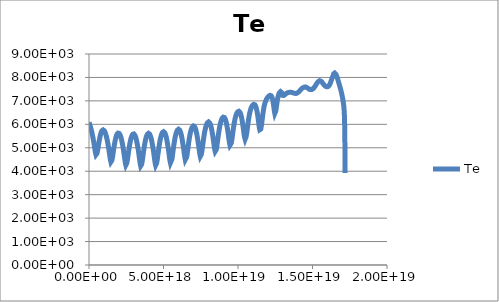
| Category | Te |
|---|---|
| 47421200000000.0 | 6086 |
| 284527000000000.0 | 6085.2 |
| 1232950000000000.0 | 6083.3 |
| 5026650000000000.0 | 6077.5 |
| 1.2007e+16 | 6064.4 |
| 2.10816e+16 | 6047.1 |
| 3.28784e+16 | 6026 |
| 4.82144e+16 | 5998.6 |
| 6.81511e+16 | 5959.8 |
| 9.19197e+16 | 5909.5 |
| 1.1692e+17 | 5852.3 |
| 1.4192e+17 | 5791.1 |
| 1.6692e+17 | 5726 |
| 1.9192e+17 | 5653.7 |
| 2.16501e+17 | 5580.8 |
| 2.39133e+17 | 5512.5 |
| 2.59097e+17 | 5448.9 |
| 2.77106e+17 | 5388 |
| 2.93684e+17 | 5330.7 |
| 3.09152e+17 | 5275.1 |
| 3.23729e+17 | 5221 |
| 3.37601e+17 | 5168.2 |
| 3.50903e+17 | 5116.3 |
| 3.63764e+17 | 5065.7 |
| 3.75989e+17 | 5018 |
| 3.87677e+17 | 4971.3 |
| 3.99209e+17 | 4925.4 |
| 4.12395e+17 | 4867.5 |
| 4.25562e+17 | 4826.5 |
| 4.38707e+17 | 4775.9 |
| 4.52783e+17 | 4738 |
| 4.6807e+17 | 4702.7 |
| 4.87942e+17 | 4683.5 |
| 5.11675e+17 | 4703.2 |
| 5.36675e+17 | 4760.1 |
| 5.61675e+17 | 4842.6 |
| 5.80268e+17 | 4884.3 |
| 5.92436e+17 | 4935.2 |
| 6.04271e+17 | 4979.9 |
| 6.17516e+17 | 5039.6 |
| 6.30871e+17 | 5082.1 |
| 6.4437e+17 | 5145 |
| 6.58497e+17 | 5191.2 |
| 6.73441e+17 | 5255.7 |
| 6.89322e+17 | 5305.9 |
| 7.0402e+17 | 5352.4 |
| 7.20723e+17 | 5415.2 |
| 7.38614e+17 | 5460.9 |
| 7.58051e+17 | 5524.2 |
| 7.79392e+17 | 5573.2 |
| 7.99955e+17 | 5620.9 |
| 8.22662e+17 | 5669.4 |
| 8.47662e+17 | 5708.7 |
| 8.72662e+17 | 5727.7 |
| 8.97662e+17 | 5747.6 |
| 9.22662e+17 | 5761.6 |
| 9.47662e+17 | 5763 |
| 9.72662e+17 | 5760.4 |
| 9.97662e+17 | 5747.8 |
| 1.02266e+18 | 5729.4 |
| 1.04766e+18 | 5704.1 |
| 1.07266e+18 | 5672.5 |
| 1.09766e+18 | 5631.7 |
| 1.12266e+18 | 5584 |
| 1.14766e+18 | 5529.5 |
| 1.17266e+18 | 5468.5 |
| 1.19766e+18 | 5396.7 |
| 1.22156e+18 | 5326.9 |
| 1.24313e+18 | 5259.7 |
| 1.26244e+18 | 5195.4 |
| 1.28e+18 | 5133.3 |
| 1.29624e+18 | 5072.8 |
| 1.31142e+18 | 5013.9 |
| 1.32577e+18 | 4956.1 |
| 1.33945e+18 | 4898.4 |
| 1.35259e+18 | 4842.8 |
| 1.3653e+18 | 4787.9 |
| 1.37769e+18 | 4733.9 |
| 1.38951e+18 | 4684.1 |
| 1.40087e+18 | 4634.7 |
| 1.41391e+18 | 4573.1 |
| 1.42696e+18 | 4527.7 |
| 1.44002e+18 | 4474.7 |
| 1.45405e+18 | 4437 |
| 1.46936e+18 | 4398.8 |
| 1.48925e+18 | 4377.8 |
| 1.513e+18 | 4401.9 |
| 1.538e+18 | 4466.9 |
| 1.563e+18 | 4558.8 |
| 1.58167e+18 | 4609.4 |
| 1.59368e+18 | 4662.7 |
| 1.6071e+18 | 4726.7 |
| 1.62046e+18 | 4779 |
| 1.63372e+18 | 4848.8 |
| 1.64752e+18 | 4895.4 |
| 1.662e+18 | 4972.8 |
| 1.67732e+18 | 5021.9 |
| 1.69141e+18 | 5078.7 |
| 1.70739e+18 | 5143.4 |
| 1.72443e+18 | 5202.6 |
| 1.74286e+18 | 5268 |
| 1.76294e+18 | 5325.8 |
| 1.78209e+18 | 5373.6 |
| 1.80389e+18 | 5439 |
| 1.82788e+18 | 5484.6 |
| 1.85205e+18 | 5530.1 |
| 1.87705e+18 | 5575.2 |
| 1.90205e+18 | 5590.8 |
| 1.92705e+18 | 5617.5 |
| 1.95205e+18 | 5624.9 |
| 1.97705e+18 | 5629.7 |
| 2.00205e+18 | 5622.9 |
| 2.02705e+18 | 5610.6 |
| 2.05205e+18 | 5589.5 |
| 2.07705e+18 | 5560.5 |
| 2.10205e+18 | 5523.5 |
| 2.12705e+18 | 5478 |
| 2.15205e+18 | 5424.2 |
| 2.17705e+18 | 5363.4 |
| 2.20205e+18 | 5290.1 |
| 2.22705e+18 | 5211.6 |
| 2.24922e+18 | 5144.6 |
| 2.26774e+18 | 5079.6 |
| 2.28474e+18 | 5016.5 |
| 2.30052e+18 | 4954.7 |
| 2.31533e+18 | 4894.2 |
| 2.32936e+18 | 4834.8 |
| 2.34275e+18 | 4776.4 |
| 2.35564e+18 | 4718.9 |
| 2.36812e+18 | 4662.3 |
| 2.3803e+18 | 4606.7 |
| 2.39229e+18 | 4551.8 |
| 2.40386e+18 | 4500.3 |
| 2.41675e+18 | 4438 |
| 2.42971e+18 | 4391.1 |
| 2.44278e+18 | 4337.7 |
| 2.45694e+18 | 4299.6 |
| 2.47252e+18 | 4263.3 |
| 2.49278e+18 | 4246.9 |
| 2.51672e+18 | 4279.4 |
| 2.54172e+18 | 4352.4 |
| 2.56672e+18 | 4451.4 |
| 2.58536e+18 | 4504.9 |
| 2.59735e+18 | 4558.1 |
| 2.61081e+18 | 4628.6 |
| 2.62431e+18 | 4682.8 |
| 2.63785e+18 | 4753 |
| 2.65198e+18 | 4811 |
| 2.66688e+18 | 4884.9 |
| 2.68195e+18 | 4940.9 |
| 2.69724e+18 | 5011.1 |
| 2.71364e+18 | 5071 |
| 2.73148e+18 | 5144.6 |
| 2.74993e+18 | 5194.6 |
| 2.76918e+18 | 5269.8 |
| 2.78953e+18 | 5315.8 |
| 2.81131e+18 | 5386.6 |
| 2.83584e+18 | 5432.5 |
| 2.86055e+18 | 5478 |
| 2.88555e+18 | 5523.7 |
| 2.91055e+18 | 5555.1 |
| 2.93555e+18 | 5574.9 |
| 2.96055e+18 | 5589.1 |
| 2.98555e+18 | 5593.3 |
| 3.01055e+18 | 5589.3 |
| 3.03555e+18 | 5577.9 |
| 3.06055e+18 | 5555.2 |
| 3.08555e+18 | 5527.4 |
| 3.11055e+18 | 5490.2 |
| 3.13555e+18 | 5443.8 |
| 3.16055e+18 | 5389.1 |
| 3.18555e+18 | 5326.3 |
| 3.21055e+18 | 5249.6 |
| 3.23555e+18 | 5167.7 |
| 3.26055e+18 | 5077.1 |
| 3.28104e+18 | 5014.1 |
| 3.29671e+18 | 4951.4 |
| 3.31157e+18 | 4889.9 |
| 3.32562e+18 | 4829.6 |
| 3.339e+18 | 4770.2 |
| 3.35185e+18 | 4711.8 |
| 3.36427e+18 | 4654.3 |
| 3.37636e+18 | 4597.7 |
| 3.38823e+18 | 4542.1 |
| 3.39999e+18 | 4487.4 |
| 3.41348e+18 | 4418.9 |
| 3.42664e+18 | 4371.2 |
| 3.43937e+18 | 4316.4 |
| 3.45303e+18 | 4279.4 |
| 3.46793e+18 | 4229.5 |
| 3.48728e+18 | 4215 |
| 3.51072e+18 | 4232.1 |
| 3.53572e+18 | 4298.2 |
| 3.56072e+18 | 4394.6 |
| 3.57924e+18 | 4447 |
| 3.59123e+18 | 4505.9 |
| 3.60316e+18 | 4558 |
| 3.61685e+18 | 4631.8 |
| 3.63065e+18 | 4689 |
| 3.64459e+18 | 4762.8 |
| 3.65922e+18 | 4824.7 |
| 3.67261e+18 | 4883.9 |
| 3.68786e+18 | 4958.2 |
| 3.70396e+18 | 5019.8 |
| 3.72114e+18 | 5095.9 |
| 3.73885e+18 | 5153.1 |
| 3.75723e+18 | 5226 |
| 3.77676e+18 | 5277.8 |
| 3.79776e+18 | 5351.6 |
| 3.82095e+18 | 5402.9 |
| 3.84476e+18 | 5463.4 |
| 3.86976e+18 | 5509.5 |
| 3.89476e+18 | 5547.6 |
| 3.91976e+18 | 5579.5 |
| 3.94476e+18 | 5598.2 |
| 3.96976e+18 | 5612.3 |
| 3.99476e+18 | 5616.7 |
| 4.01976e+18 | 5612.6 |
| 4.04476e+18 | 5599.6 |
| 4.06976e+18 | 5579.9 |
| 4.09476e+18 | 5549.5 |
| 4.11976e+18 | 5510.8 |
| 4.14476e+18 | 5463 |
| 4.16976e+18 | 5406.7 |
| 4.19476e+18 | 5337.3 |
| 4.21976e+18 | 5261.4 |
| 4.24476e+18 | 5176.1 |
| 4.26976e+18 | 5081.8 |
| 4.28979e+18 | 5020.5 |
| 4.30462e+18 | 4958.6 |
| 4.31884e+18 | 4897.9 |
| 4.33232e+18 | 4838.2 |
| 4.34522e+18 | 4779.5 |
| 4.35765e+18 | 4721.7 |
| 4.36971e+18 | 4664.9 |
| 4.38149e+18 | 4609 |
| 4.39309e+18 | 4554.1 |
| 4.40463e+18 | 4500.2 |
| 4.4179e+18 | 4433.2 |
| 4.43095e+18 | 4386.4 |
| 4.44372e+18 | 4333.1 |
| 4.45761e+18 | 4294.8 |
| 4.47297e+18 | 4258.4 |
| 4.49294e+18 | 4241.1 |
| 4.51673e+18 | 4276.1 |
| 4.54173e+18 | 4351.6 |
| 4.56673e+18 | 4454.1 |
| 4.58505e+18 | 4506.9 |
| 4.59844e+18 | 4578.6 |
| 4.61191e+18 | 4635.2 |
| 4.6255e+18 | 4709.3 |
| 4.63953e+18 | 4770.1 |
| 4.65207e+18 | 4828.5 |
| 4.66631e+18 | 4902.6 |
| 4.68117e+18 | 4963.5 |
| 4.69686e+18 | 5039.6 |
| 4.71364e+18 | 5104.4 |
| 4.72917e+18 | 5163.3 |
| 4.74668e+18 | 5235.8 |
| 4.76529e+18 | 5296.2 |
| 4.78535e+18 | 5365.5 |
| 4.80757e+18 | 5425.4 |
| 4.83095e+18 | 5485.8 |
| 4.85595e+18 | 5537.4 |
| 4.88095e+18 | 5584.5 |
| 4.90595e+18 | 5622.5 |
| 4.93095e+18 | 5653 |
| 4.95595e+18 | 5668 |
| 4.98095e+18 | 5681.7 |
| 5.00595e+18 | 5684.9 |
| 5.03095e+18 | 5680.3 |
| 5.05595e+18 | 5666 |
| 5.08095e+18 | 5643.1 |
| 5.10595e+18 | 5611.6 |
| 5.13095e+18 | 5570.9 |
| 5.15595e+18 | 5520.7 |
| 5.18095e+18 | 5462 |
| 5.20595e+18 | 5388.9 |
| 5.23095e+18 | 5309.5 |
| 5.25595e+18 | 5220.4 |
| 5.28095e+18 | 5122.2 |
| 5.30527e+18 | 5021.7 |
| 5.32343e+18 | 4963.3 |
| 5.33802e+18 | 4888.8 |
| 5.3522e+18 | 4832.5 |
| 5.36405e+18 | 4776.3 |
| 5.37573e+18 | 4720.8 |
| 5.38719e+18 | 4666.1 |
| 5.39851e+18 | 4611.8 |
| 5.41148e+18 | 4545.7 |
| 5.42448e+18 | 4495.8 |
| 5.4375e+18 | 4438.3 |
| 5.45102e+18 | 4399.1 |
| 5.4652e+18 | 4358.6 |
| 5.48363e+18 | 4328.2 |
| 5.50655e+18 | 4340.3 |
| 5.53155e+18 | 4400.5 |
| 5.55655e+18 | 4494 |
| 5.57546e+18 | 4549.7 |
| 5.58804e+18 | 4606.6 |
| 5.60031e+18 | 4664.6 |
| 5.61434e+18 | 4741.3 |
| 5.62847e+18 | 4801.5 |
| 5.64068e+18 | 4859.4 |
| 5.65449e+18 | 4933.3 |
| 5.66884e+18 | 4993.8 |
| 5.68387e+18 | 5069.9 |
| 5.69914e+18 | 5128.5 |
| 5.71471e+18 | 5200.8 |
| 5.73116e+18 | 5259.5 |
| 5.74875e+18 | 5333.4 |
| 5.7676e+18 | 5392.8 |
| 5.78809e+18 | 5466 |
| 5.81075e+18 | 5527.4 |
| 5.83433e+18 | 5589.9 |
| 5.85933e+18 | 5637.1 |
| 5.88433e+18 | 5685.5 |
| 5.90933e+18 | 5724.9 |
| 5.93433e+18 | 5754 |
| 5.95933e+18 | 5774.4 |
| 5.98433e+18 | 5786.5 |
| 6.00933e+18 | 5790.6 |
| 6.03433e+18 | 5787.3 |
| 6.05933e+18 | 5774.1 |
| 6.08433e+18 | 5752.1 |
| 6.10933e+18 | 5721.5 |
| 6.13433e+18 | 5681.7 |
| 6.15933e+18 | 5632.4 |
| 6.18433e+18 | 5574.1 |
| 6.20933e+18 | 5500.9 |
| 6.23433e+18 | 5421.2 |
| 6.25933e+18 | 5331.6 |
| 6.28421e+18 | 5233.7 |
| 6.30782e+18 | 5137.6 |
| 6.3295e+18 | 5043.2 |
| 6.34572e+18 | 4995 |
| 6.35898e+18 | 4917.9 |
| 6.37182e+18 | 4872.6 |
| 6.3841e+18 | 4800.1 |
| 6.39624e+18 | 4750.8 |
| 6.40818e+18 | 4689.1 |
| 6.42045e+18 | 4640 |
| 6.43314e+18 | 4582.1 |
| 6.4465e+18 | 4537.9 |
| 6.46073e+18 | 4491.6 |
| 6.47922e+18 | 4457.6 |
| 6.50217e+18 | 4462.1 |
| 6.52717e+18 | 4514.5 |
| 6.55217e+18 | 4602.6 |
| 6.57152e+18 | 4660.4 |
| 6.58471e+18 | 4717.8 |
| 6.59725e+18 | 4776.3 |
| 6.61155e+18 | 4854.1 |
| 6.62523e+18 | 4908.8 |
| 6.63814e+18 | 4979 |
| 6.65163e+18 | 5038.1 |
| 6.66589e+18 | 5113.2 |
| 6.68024e+18 | 5170.6 |
| 6.6947e+18 | 5241.8 |
| 6.70989e+18 | 5303.2 |
| 6.72604e+18 | 5373.6 |
| 6.74331e+18 | 5437.8 |
| 6.76204e+18 | 5508.8 |
| 6.78237e+18 | 5570.7 |
| 6.80462e+18 | 5643.6 |
| 6.82875e+18 | 5698.1 |
| 6.85287e+18 | 5759.3 |
| 6.87787e+18 | 5811.8 |
| 6.90287e+18 | 5847.6 |
| 6.92787e+18 | 5881.9 |
| 6.95287e+18 | 5902.3 |
| 6.97787e+18 | 5920.4 |
| 7.00287e+18 | 5928.8 |
| 7.02787e+18 | 5929.3 |
| 7.05287e+18 | 5921 |
| 7.07787e+18 | 5903.9 |
| 7.10287e+18 | 5878.2 |
| 7.12787e+18 | 5843.1 |
| 7.15287e+18 | 5798.4 |
| 7.17787e+18 | 5744.8 |
| 7.20287e+18 | 5676.5 |
| 7.22787e+18 | 5601.1 |
| 7.25287e+18 | 5515.3 |
| 7.2775e+18 | 5422.6 |
| 7.30063e+18 | 5331.1 |
| 7.32187e+18 | 5240.5 |
| 7.34178e+18 | 5151.3 |
| 7.35691e+18 | 5105.5 |
| 7.36948e+18 | 5031.6 |
| 7.38172e+18 | 4988.9 |
| 7.39354e+18 | 4919.8 |
| 7.40529e+18 | 4876.4 |
| 7.41697e+18 | 4814.8 |
| 7.42898e+18 | 4770.4 |
| 7.44144e+18 | 4716.9 |
| 7.45498e+18 | 4677.2 |
| 7.46991e+18 | 4635.4 |
| 7.48932e+18 | 4619.2 |
| 7.51279e+18 | 4646 |
| 7.53779e+18 | 4714.3 |
| 7.56279e+18 | 4811.4 |
| 7.58162e+18 | 4867.4 |
| 7.59618e+18 | 4944 |
| 7.61064e+18 | 5003.8 |
| 7.6227e+18 | 5060.3 |
| 7.6361e+18 | 5133.1 |
| 7.64988e+18 | 5192.7 |
| 7.66215e+18 | 5253.2 |
| 7.67608e+18 | 5321.3 |
| 7.69046e+18 | 5382.7 |
| 7.70541e+18 | 5450.9 |
| 7.72134e+18 | 5512.6 |
| 7.73853e+18 | 5585.8 |
| 7.75708e+18 | 5649.3 |
| 7.77739e+18 | 5723.9 |
| 7.79897e+18 | 5778.3 |
| 7.82158e+18 | 5850.7 |
| 7.84658e+18 | 5902.7 |
| 7.87158e+18 | 5953.3 |
| 7.89658e+18 | 6006.5 |
| 7.92158e+18 | 6039.2 |
| 7.94658e+18 | 6064.3 |
| 7.97158e+18 | 6085.6 |
| 7.99658e+18 | 6097.7 |
| 8.02158e+18 | 6102.2 |
| 8.04658e+18 | 6098.6 |
| 8.07158e+18 | 6087.6 |
| 8.09658e+18 | 6059.1 |
| 8.12158e+18 | 6035.1 |
| 8.14658e+18 | 5997.5 |
| 8.17158e+18 | 5948.6 |
| 8.19658e+18 | 5885.8 |
| 8.22158e+18 | 5815.1 |
| 8.24658e+18 | 5733.7 |
| 8.27085e+18 | 5647.3 |
| 8.29331e+18 | 5561.4 |
| 8.31394e+18 | 5475.8 |
| 8.33327e+18 | 5390.9 |
| 8.35163e+18 | 5307.1 |
| 8.36928e+18 | 5225 |
| 8.383e+18 | 5179.6 |
| 8.39458e+18 | 5115.2 |
| 8.40616e+18 | 5070.7 |
| 8.41775e+18 | 5012.4 |
| 8.42961e+18 | 4970.5 |
| 8.44182e+18 | 4914.6 |
| 8.45498e+18 | 4880.8 |
| 8.46937e+18 | 4844.6 |
| 8.48807e+18 | 4824.1 |
| 8.51115e+18 | 4846.9 |
| 8.53615e+18 | 4911.3 |
| 8.56115e+18 | 5005.7 |
| 8.58026e+18 | 5063.4 |
| 8.59268e+18 | 5118.4 |
| 8.60602e+18 | 5187.6 |
| 8.61931e+18 | 5246.1 |
| 8.63253e+18 | 5315 |
| 8.64561e+18 | 5370 |
| 8.6585e+18 | 5437.7 |
| 8.67195e+18 | 5497 |
| 8.6861e+18 | 5566.3 |
| 8.70105e+18 | 5629.9 |
| 8.71702e+18 | 5700.3 |
| 8.73369e+18 | 5752.2 |
| 8.75128e+18 | 5831.8 |
| 8.76991e+18 | 5883 |
| 8.78991e+18 | 5960 |
| 8.81186e+18 | 6012.3 |
| 8.83501e+18 | 6082.7 |
| 8.86001e+18 | 6134.4 |
| 8.88501e+18 | 6181.1 |
| 8.91001e+18 | 6221.8 |
| 8.93501e+18 | 6253.9 |
| 8.96001e+18 | 6278.6 |
| 8.98501e+18 | 6296.2 |
| 9.01001e+18 | 6306.6 |
| 9.03501e+18 | 6310.6 |
| 9.06001e+18 | 6305.5 |
| 9.08501e+18 | 6292 |
| 9.11001e+18 | 6270.3 |
| 9.13501e+18 | 6239.3 |
| 9.16001e+18 | 6198.8 |
| 9.18501e+18 | 6148.5 |
| 9.21001e+18 | 6082.9 |
| 9.23501e+18 | 6009.2 |
| 9.25916e+18 | 5930.5 |
| 9.28128e+18 | 5851.4 |
| 9.30145e+18 | 5771.9 |
| 9.32027e+18 | 5692.2 |
| 9.33807e+18 | 5612.7 |
| 9.35512e+18 | 5534 |
| 9.37163e+18 | 5456.6 |
| 9.38779e+18 | 5381.4 |
| 9.40063e+18 | 5335.8 |
| 9.41172e+18 | 5275.3 |
| 9.42308e+18 | 5237 |
| 9.43479e+18 | 5180.3 |
| 9.44712e+18 | 5146.8 |
| 9.46023e+18 | 5110.9 |
| 9.47727e+18 | 5076.3 |
| 9.4994e+18 | 5073.1 |
| 9.5244e+18 | 5118.2 |
| 9.5494e+18 | 5199.1 |
| 9.5744e+18 | 5303.3 |
| 9.59244e+18 | 5353.5 |
| 9.60518e+18 | 5422.6 |
| 9.61832e+18 | 5483.2 |
| 9.62985e+18 | 5532.4 |
| 9.64269e+18 | 5604.6 |
| 9.65585e+18 | 5662.1 |
| 9.66945e+18 | 5732.8 |
| 9.6837e+18 | 5794.4 |
| 9.6988e+18 | 5866.3 |
| 9.71444e+18 | 5916 |
| 9.73079e+18 | 5997.2 |
| 9.74797e+18 | 6051.8 |
| 9.76625e+18 | 6125 |
| 9.78623e+18 | 6176.2 |
| 9.80837e+18 | 6253.8 |
| 9.8327e+18 | 6309.8 |
| 9.85703e+18 | 6362.5 |
| 9.88203e+18 | 6418.6 |
| 9.90703e+18 | 6454 |
| 9.93203e+18 | 6489.1 |
| 9.95703e+18 | 6513 |
| 9.98203e+18 | 6534.5 |
| 1.0007e+19 | 6548.6 |
| 1.0032e+19 | 6556.5 |
| 1.0057e+19 | 6556.7 |
| 1.0082e+19 | 6549.2 |
| 1.0107e+19 | 6534.1 |
| 1.0132e+19 | 6510.1 |
| 1.0157e+19 | 6476.8 |
| 1.0182e+19 | 6433.9 |
| 1.0207e+19 | 6375.8 |
| 1.0232e+19 | 6308.7 |
| 1.02555e+19 | 6239.5 |
| 1.02764e+19 | 6167.7 |
| 1.02954e+19 | 6096.7 |
| 1.03132e+19 | 6024.8 |
| 1.03299e+19 | 5951.6 |
| 1.03459e+19 | 5878 |
| 1.03614e+19 | 5804.8 |
| 1.03765e+19 | 5732.5 |
| 1.03914e+19 | 5662 |
| 1.04085e+19 | 5570.6 |
| 1.04257e+19 | 5506.6 |
| 1.04383e+19 | 5469.2 |
| 1.04499e+19 | 5425.6 |
| 1.04629e+19 | 5392.2 |
| 1.04777e+19 | 5365 |
| 1.0497e+19 | 5357.7 |
| 1.05203e+19 | 5398.2 |
| 1.05453e+19 | 5475 |
| 1.05703e+19 | 5578.1 |
| 1.05887e+19 | 5632.5 |
| 1.06001e+19 | 5684 |
| 1.06128e+19 | 5756 |
| 1.06255e+19 | 5809.8 |
| 1.06382e+19 | 5882 |
| 1.06513e+19 | 5940.5 |
| 1.0665e+19 | 6013.8 |
| 1.06791e+19 | 6071.1 |
| 1.06935e+19 | 6143.9 |
| 1.07088e+19 | 6202.9 |
| 1.07252e+19 | 6275.9 |
| 1.07426e+19 | 6332.1 |
| 1.07614e+19 | 6406.7 |
| 1.07816e+19 | 6462 |
| 1.08035e+19 | 6531.9 |
| 1.08278e+19 | 6586.6 |
| 1.08521e+19 | 6639.7 |
| 1.08771e+19 | 6693 |
| 1.09021e+19 | 6727.5 |
| 1.09271e+19 | 6762.9 |
| 1.09521e+19 | 6790.4 |
| 1.09771e+19 | 6813.2 |
| 1.10021e+19 | 6831.4 |
| 1.10271e+19 | 6844.5 |
| 1.10521e+19 | 6851.8 |
| 1.10771e+19 | 6853.4 |
| 1.11021e+19 | 6848.7 |
| 1.11271e+19 | 6836.7 |
| 1.11521e+19 | 6816.4 |
| 1.11771e+19 | 6787.5 |
| 1.12021e+19 | 6744.9 |
| 1.12271e+19 | 6692.2 |
| 1.12521e+19 | 6626.2 |
| 1.12746e+19 | 6562 |
| 1.12938e+19 | 6496.5 |
| 1.13115e+19 | 6428.2 |
| 1.13274e+19 | 6365.1 |
| 1.13419e+19 | 6299.1 |
| 1.13559e+19 | 6232.4 |
| 1.13696e+19 | 6165.2 |
| 1.1383e+19 | 6098.1 |
| 1.13964e+19 | 6031.7 |
| 1.14117e+19 | 5949.7 |
| 1.14272e+19 | 5888.1 |
| 1.14429e+19 | 5819.8 |
| 1.14604e+19 | 5770.9 |
| 1.14801e+19 | 5735.5 |
| 1.15038e+19 | 5743.9 |
| 1.15288e+19 | 5799.6 |
| 1.15538e+19 | 5892.7 |
| 1.15726e+19 | 5954.1 |
| 1.15849e+19 | 6007.7 |
| 1.15966e+19 | 6064.2 |
| 1.16082e+19 | 6127.7 |
| 1.16215e+19 | 6202 |
| 1.16349e+19 | 6262 |
| 1.16485e+19 | 6338.7 |
| 1.16623e+19 | 6396.1 |
| 1.16765e+19 | 6471.3 |
| 1.16915e+19 | 6528.1 |
| 1.17074e+19 | 6602.5 |
| 1.17242e+19 | 6661.1 |
| 1.17423e+19 | 6731.9 |
| 1.17617e+19 | 6791.4 |
| 1.17828e+19 | 6846.2 |
| 1.18059e+19 | 6897.1 |
| 1.18295e+19 | 6940.9 |
| 1.18545e+19 | 6989.3 |
| 1.18795e+19 | 7029 |
| 1.19045e+19 | 7063.5 |
| 1.19295e+19 | 7094.1 |
| 1.19545e+19 | 7119.5 |
| 1.19795e+19 | 7139.7 |
| 1.20045e+19 | 7162.8 |
| 1.20295e+19 | 7180.4 |
| 1.20545e+19 | 7198.1 |
| 1.20795e+19 | 7209.4 |
| 1.21045e+19 | 7222.8 |
| 1.21295e+19 | 7230.6 |
| 1.21545e+19 | 7236.5 |
| 1.21795e+19 | 7235.8 |
| 1.22045e+19 | 7228.8 |
| 1.22295e+19 | 7216.4 |
| 1.22545e+19 | 7192 |
| 1.22781e+19 | 7159.5 |
| 1.22989e+19 | 7121.4 |
| 1.23173e+19 | 7078 |
| 1.23337e+19 | 7030.8 |
| 1.23484e+19 | 6981.8 |
| 1.23622e+19 | 6930.1 |
| 1.23754e+19 | 6875.3 |
| 1.23878e+19 | 6822.3 |
| 1.24014e+19 | 6751.1 |
| 1.24149e+19 | 6693.9 |
| 1.24266e+19 | 6639.9 |
| 1.244e+19 | 6572.6 |
| 1.24544e+19 | 6518.9 |
| 1.24699e+19 | 6469.4 |
| 1.24901e+19 | 6455.3 |
| 1.25139e+19 | 6491.2 |
| 1.25389e+19 | 6575.4 |
| 1.25639e+19 | 6690.1 |
| 1.25833e+19 | 6762.8 |
| 1.25967e+19 | 6820.8 |
| 1.26096e+19 | 6884.7 |
| 1.26242e+19 | 6961.1 |
| 1.2639e+19 | 7017.4 |
| 1.26542e+19 | 7080.9 |
| 1.26699e+19 | 7130.1 |
| 1.26864e+19 | 7181.8 |
| 1.27038e+19 | 7224.5 |
| 1.27223e+19 | 7262 |
| 1.2742e+19 | 7294.1 |
| 1.27633e+19 | 7329.6 |
| 1.27864e+19 | 7355.3 |
| 1.28064e+19 | 7372.6 |
| 1.28235e+19 | 7384.8 |
| 1.28396e+19 | 7393.4 |
| 1.2855e+19 | 7394.9 |
| 1.28695e+19 | 7401.2 |
| 1.28828e+19 | 7398.1 |
| 1.28952e+19 | 7395.2 |
| 1.2907e+19 | 7384.3 |
| 1.29184e+19 | 7371.7 |
| 1.29296e+19 | 7353.5 |
| 1.29425e+19 | 7330.1 |
| 1.2957e+19 | 7298.9 |
| 1.29737e+19 | 7264.4 |
| 1.29954e+19 | 7236.6 |
| 1.30201e+19 | 7222.8 |
| 1.30451e+19 | 7223.8 |
| 1.30701e+19 | 7233.5 |
| 1.30951e+19 | 7244.2 |
| 1.31201e+19 | 7254.5 |
| 1.31451e+19 | 7267.4 |
| 1.31701e+19 | 7280.1 |
| 1.31951e+19 | 7293.9 |
| 1.32201e+19 | 7305.8 |
| 1.32451e+19 | 7317.8 |
| 1.32701e+19 | 7328.6 |
| 1.32951e+19 | 7338.3 |
| 1.33201e+19 | 7342.8 |
| 1.33451e+19 | 7354.7 |
| 1.3369e+19 | 7357.9 |
| 1.3391e+19 | 7356.8 |
| 1.34117e+19 | 7368.6 |
| 1.3432e+19 | 7363.1 |
| 1.3453e+19 | 7364.6 |
| 1.34764e+19 | 7364.7 |
| 1.35014e+19 | 7366 |
| 1.35264e+19 | 7367.4 |
| 1.35514e+19 | 7366.8 |
| 1.35743e+19 | 7366.6 |
| 1.35932e+19 | 7364.1 |
| 1.36098e+19 | 7362.9 |
| 1.36258e+19 | 7359.7 |
| 1.3644e+19 | 7355.7 |
| 1.36623e+19 | 7353.2 |
| 1.36807e+19 | 7346.3 |
| 1.36998e+19 | 7345.4 |
| 1.37198e+19 | 7334.5 |
| 1.37411e+19 | 7336.9 |
| 1.37635e+19 | 7327.2 |
| 1.37877e+19 | 7319.6 |
| 1.38119e+19 | 7318.4 |
| 1.38369e+19 | 7320.2 |
| 1.38619e+19 | 7314.8 |
| 1.38869e+19 | 7319.1 |
| 1.39119e+19 | 7319.9 |
| 1.39369e+19 | 7329.7 |
| 1.39619e+19 | 7329.6 |
| 1.39869e+19 | 7340.3 |
| 1.40119e+19 | 7350.8 |
| 1.40369e+19 | 7362.8 |
| 1.40619e+19 | 7377.2 |
| 1.40869e+19 | 7392.3 |
| 1.41119e+19 | 7408.3 |
| 1.41369e+19 | 7425.3 |
| 1.41619e+19 | 7442.7 |
| 1.41869e+19 | 7461.8 |
| 1.42119e+19 | 7478.8 |
| 1.42369e+19 | 7496.5 |
| 1.42619e+19 | 7513.2 |
| 1.42869e+19 | 7529 |
| 1.43119e+19 | 7543.5 |
| 1.43279e+19 | 7547.9 |
| 1.43331e+19 | 7547 |
| 1.4336e+19 | 7553.3 |
| 1.4339e+19 | 7553.3 |
| 1.43429e+19 | 7555.7 |
| 1.43479e+19 | 7557.2 |
| 1.43544e+19 | 7561.3 |
| 1.43629e+19 | 7565.6 |
| 1.4374e+19 | 7570.9 |
| 1.43884e+19 | 7576.4 |
| 1.44069e+19 | 7584 |
| 1.44275e+19 | 7579.3 |
| 1.44483e+19 | 7591.6 |
| 1.44715e+19 | 7593.9 |
| 1.44965e+19 | 7594.7 |
| 1.45215e+19 | 7588.7 |
| 1.45465e+19 | 7593.1 |
| 1.45715e+19 | 7585.6 |
| 1.45919e+19 | 7576.7 |
| 1.46075e+19 | 7575.5 |
| 1.46225e+19 | 7571.6 |
| 1.46396e+19 | 7559.4 |
| 1.46567e+19 | 7559.4 |
| 1.46737e+19 | 7548.3 |
| 1.46914e+19 | 7541.1 |
| 1.47099e+19 | 7531.2 |
| 1.47293e+19 | 7524.1 |
| 1.47499e+19 | 7509.6 |
| 1.47718e+19 | 7507.8 |
| 1.47947e+19 | 7490.8 |
| 1.48196e+19 | 7488 |
| 1.48446e+19 | 7483.4 |
| 1.48696e+19 | 7480.5 |
| 1.48946e+19 | 7476.9 |
| 1.49196e+19 | 7480.3 |
| 1.49446e+19 | 7482.7 |
| 1.49696e+19 | 7490.3 |
| 1.49946e+19 | 7497.7 |
| 1.50196e+19 | 7509 |
| 1.50446e+19 | 7521.5 |
| 1.50696e+19 | 7537.7 |
| 1.50946e+19 | 7555.6 |
| 1.51196e+19 | 7576 |
| 1.51446e+19 | 7597.8 |
| 1.51696e+19 | 7621.3 |
| 1.51946e+19 | 7648.4 |
| 1.52196e+19 | 7672.9 |
| 1.52446e+19 | 7699.3 |
| 1.52696e+19 | 7725.2 |
| 1.52946e+19 | 7750.6 |
| 1.53196e+19 | 7773.9 |
| 1.53352e+19 | 7780.4 |
| 1.53396e+19 | 7783 |
| 1.53425e+19 | 7783.1 |
| 1.53463e+19 | 7790.4 |
| 1.53511e+19 | 7793 |
| 1.53575e+19 | 7802.5 |
| 1.53658e+19 | 7805.8 |
| 1.53765e+19 | 7816.4 |
| 1.53904e+19 | 7827 |
| 1.54086e+19 | 7844 |
| 1.5429e+19 | 7847.5 |
| 1.54499e+19 | 7856.6 |
| 1.54732e+19 | 7861.1 |
| 1.54982e+19 | 7861.2 |
| 1.55232e+19 | 7854.5 |
| 1.55482e+19 | 7847.9 |
| 1.55732e+19 | 7835.5 |
| 1.55928e+19 | 7834.3 |
| 1.56068e+19 | 7817.9 |
| 1.56205e+19 | 7816.8 |
| 1.56361e+19 | 7799.9 |
| 1.56517e+19 | 7790.2 |
| 1.56672e+19 | 7770.1 |
| 1.56832e+19 | 7763 |
| 1.56999e+19 | 7743.5 |
| 1.57173e+19 | 7736.7 |
| 1.57357e+19 | 7715.1 |
| 1.57552e+19 | 7700.9 |
| 1.57761e+19 | 7676.7 |
| 1.57986e+19 | 7666.7 |
| 1.58216e+19 | 7648.2 |
| 1.58466e+19 | 7638.8 |
| 1.58716e+19 | 7622 |
| 1.58966e+19 | 7616.9 |
| 1.59216e+19 | 7601.8 |
| 1.59466e+19 | 7601.4 |
| 1.59716e+19 | 7599.1 |
| 1.59966e+19 | 7603 |
| 1.60216e+19 | 7605.5 |
| 1.60466e+19 | 7614 |
| 1.60716e+19 | 7623.5 |
| 1.60966e+19 | 7639.4 |
| 1.61216e+19 | 7663.5 |
| 1.61466e+19 | 7688.3 |
| 1.61716e+19 | 7719.5 |
| 1.61966e+19 | 7756.3 |
| 1.62216e+19 | 7799.4 |
| 1.62466e+19 | 7844.2 |
| 1.62716e+19 | 7892.1 |
| 1.62966e+19 | 7941.2 |
| 1.63216e+19 | 7990.1 |
| 1.63373e+19 | 8002.5 |
| 1.63412e+19 | 8006.9 |
| 1.63424e+19 | 8007.1 |
| 1.63432e+19 | 8009.5 |
| 1.63443e+19 | 8010.7 |
| 1.63457e+19 | 8014.6 |
| 1.63474e+19 | 8018.1 |
| 1.63498e+19 | 8023.8 |
| 1.63528e+19 | 8027.7 |
| 1.63567e+19 | 8037.5 |
| 1.63619e+19 | 8047.7 |
| 1.63685e+19 | 8061 |
| 1.63772e+19 | 8076.6 |
| 1.63884e+19 | 8099.4 |
| 1.6403e+19 | 8121.2 |
| 1.64216e+19 | 8154.2 |
| 1.64424e+19 | 8167.1 |
| 1.64647e+19 | 8181.7 |
| 1.64891e+19 | 8187.8 |
| 1.65141e+19 | 8181.6 |
| 1.65391e+19 | 8164.5 |
| 1.65641e+19 | 8138.4 |
| 1.6583e+19 | 8122.3 |
| 1.65956e+19 | 8106.6 |
| 1.66077e+19 | 8085.5 |
| 1.66198e+19 | 8065.9 |
| 1.66335e+19 | 8033.8 |
| 1.66474e+19 | 8017.8 |
| 1.66612e+19 | 7982.4 |
| 1.66755e+19 | 7962.7 |
| 1.66905e+19 | 7928.7 |
| 1.67061e+19 | 7899.4 |
| 1.67226e+19 | 7860.5 |
| 1.674e+19 | 7831.3 |
| 1.67586e+19 | 7782.5 |
| 1.67781e+19 | 7748.3 |
| 1.6799e+19 | 7694.7 |
| 1.68213e+19 | 7652.2 |
| 1.68444e+19 | 7596.4 |
| 1.68691e+19 | 7541.8 |
| 1.68938e+19 | 7483.2 |
| 1.69184e+19 | 7418.4 |
| 1.69419e+19 | 7358.1 |
| 1.6964e+19 | 7296.1 |
| 1.69849e+19 | 7232.9 |
| 1.70044e+19 | 7169.9 |
| 1.70224e+19 | 7107 |
| 1.70389e+19 | 7050.1 |
| 1.70515e+19 | 7001 |
| 1.70625e+19 | 6953.6 |
| 1.70768e+19 | 6891.1 |
| 1.70916e+19 | 6829.5 |
| 1.71047e+19 | 6745.1 |
| 1.71166e+19 | 6659.3 |
| 1.71271e+19 | 6561.3 |
| 1.7136e+19 | 6450.1 |
| 1.71437e+19 | 6323.8 |
| 1.71499e+19 | 6189.9 |
| 1.71546e+19 | 6063.3 |
| 1.71582e+19 | 5950.3 |
| 1.71611e+19 | 5842.2 |
| 1.71638e+19 | 5729.4 |
| 1.71664e+19 | 5611.3 |
| 1.71687e+19 | 5490.7 |
| 1.71708e+19 | 5373.6 |
| 1.71727e+19 | 5258 |
| 1.71745e+19 | 5141.1 |
| 1.71761e+19 | 5023.7 |
| 1.71775e+19 | 4928 |
| 1.71785e+19 | 4852.7 |
| 1.71794e+19 | 4775.8 |
| 1.71804e+19 | 4691.7 |
| 1.71815e+19 | 4597 |
| 1.71825e+19 | 4503.7 |
| 1.71835e+19 | 4411.3 |
| 1.71845e+19 | 4317.9 |
| 1.71855e+19 | 4222 |
| 1.71864e+19 | 4129.2 |
| 1.71874e+19 | 4028.8 |
| 1.71883e+19 | 3927.6 |